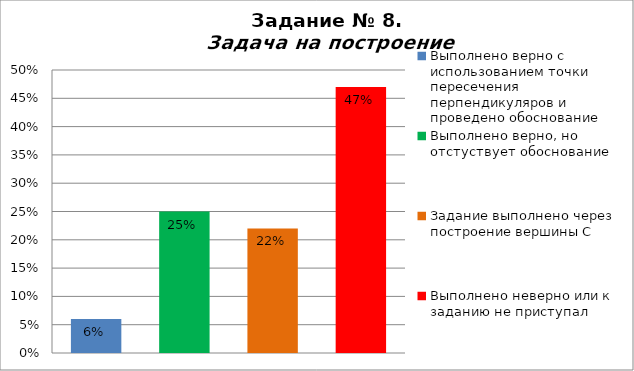
| Category | Задача на построение |
|---|---|
| Выполнено верно с использованием точки пересечения перпендикуляров и проведено обоснование | 0.06 |
| Выполнено верно, но отстуствует обоснование | 0.25 |
| Задание выполнено через построение вершины С | 0.22 |
| Выполнено неверно или к заданию не приступал | 0.47 |